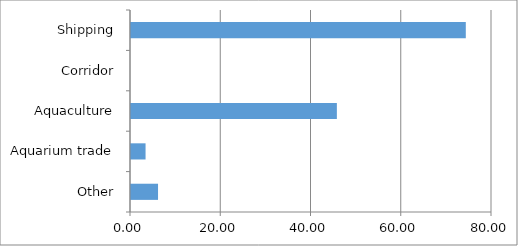
| Category | Series 0 |
|---|---|
| Other | 5.991 |
| Aquarium trade | 3.226 |
| Aquaculture | 45.622 |
| Corridor | 0 |
| Shipping | 74.194 |